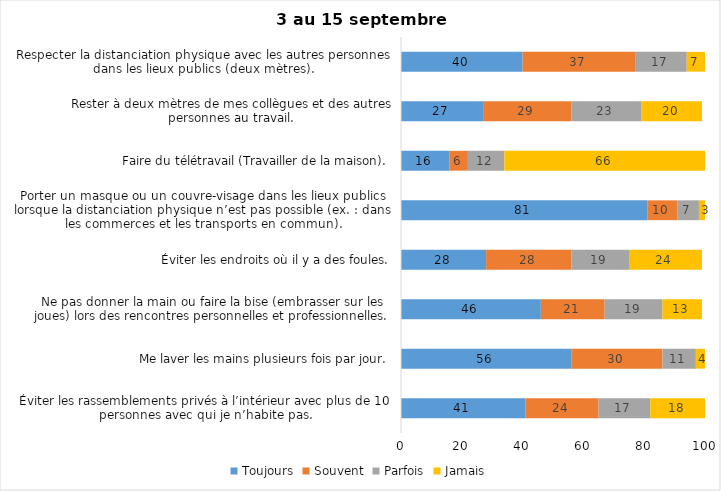
| Category | Toujours | Souvent | Parfois | Jamais |
|---|---|---|---|---|
| Éviter les rassemblements privés à l’intérieur avec plus de 10 personnes avec qui je n’habite pas. | 41 | 24 | 17 | 18 |
| Me laver les mains plusieurs fois par jour. | 56 | 30 | 11 | 4 |
| Ne pas donner la main ou faire la bise (embrasser sur les joues) lors des rencontres personnelles et professionnelles. | 46 | 21 | 19 | 13 |
| Éviter les endroits où il y a des foules. | 28 | 28 | 19 | 24 |
| Porter un masque ou un couvre-visage dans les lieux publics lorsque la distanciation physique n’est pas possible (ex. : dans les commerces et les transports en commun). | 81 | 10 | 7 | 3 |
| Faire du télétravail (Travailler de la maison). | 16 | 6 | 12 | 66 |
| Rester à deux mètres de mes collègues et des autres personnes au travail. | 27 | 29 | 23 | 20 |
| Respecter la distanciation physique avec les autres personnes dans les lieux publics (deux mètres). | 40 | 37 | 17 | 7 |